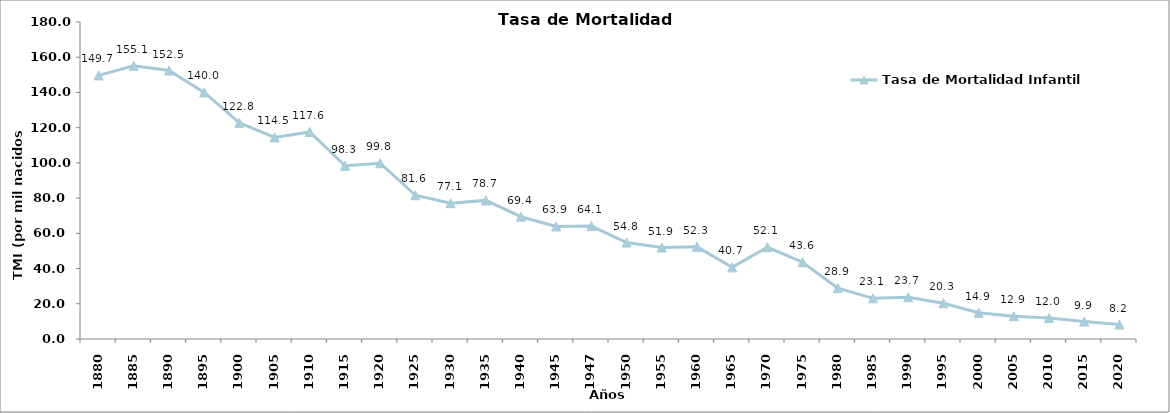
| Category | Tasa de Mortalidad Infantil |
|---|---|
| 1880.0 | 149.687 |
| 1885.0 | 155.15 |
| 1890.0 | 152.453 |
| 1895.0 | 140.017 |
| 1900.0 | 122.756 |
| 1905.0 | 114.476 |
| 1910.0 | 117.571 |
| 1915.0 | 98.342 |
| 1920.0 | 99.808 |
| 1925.0 | 81.627 |
| 1930.0 | 77.091 |
| 1935.0 | 78.7 |
| 1940.0 | 69.436 |
| 1945.0 | 63.917 |
| 1947.0 | 64.094 |
| 1950.0 | 54.764 |
| 1955.0 | 51.938 |
| 1960.0 | 52.331 |
| 1965.0 | 40.696 |
| 1970.0 | 52.1 |
| 1975.0 | 43.6 |
| 1980.0 | 28.9 |
| 1985.0 | 23.1 |
| 1990.0 | 23.7 |
| 1995.0 | 20.3 |
| 2000.0 | 14.9 |
| 2005.0 | 12.9 |
| 2010.0 | 11.958 |
| 2015.0 | 9.9 |
| 2020.0 | 8.22 |